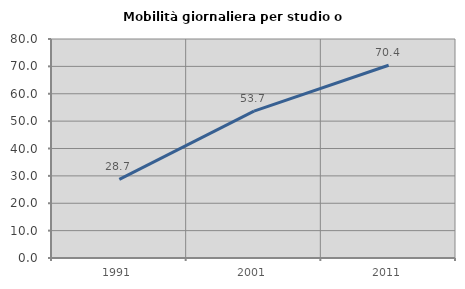
| Category | Mobilità giornaliera per studio o lavoro |
|---|---|
| 1991.0 | 28.736 |
| 2001.0 | 53.659 |
| 2011.0 | 70.408 |